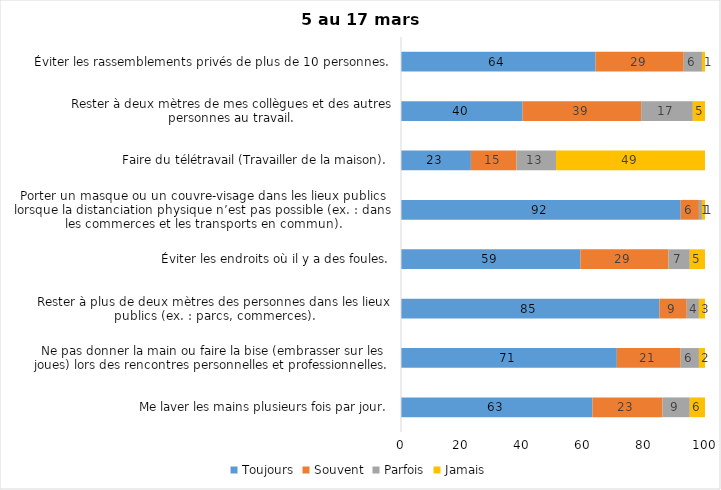
| Category | Toujours | Souvent | Parfois | Jamais |
|---|---|---|---|---|
| Me laver les mains plusieurs fois par jour. | 63 | 23 | 9 | 6 |
| Ne pas donner la main ou faire la bise (embrasser sur les joues) lors des rencontres personnelles et professionnelles. | 71 | 21 | 6 | 2 |
| Rester à plus de deux mètres des personnes dans les lieux publics (ex. : parcs, commerces). | 85 | 9 | 4 | 3 |
| Éviter les endroits où il y a des foules. | 59 | 29 | 7 | 5 |
| Porter un masque ou un couvre-visage dans les lieux publics lorsque la distanciation physique n’est pas possible (ex. : dans les commerces et les transports en commun). | 92 | 6 | 1 | 1 |
| Faire du télétravail (Travailler de la maison). | 23 | 15 | 13 | 49 |
| Rester à deux mètres de mes collègues et des autres personnes au travail. | 40 | 39 | 17 | 5 |
| Éviter les rassemblements privés de plus de 10 personnes. | 64 | 29 | 6 | 1 |